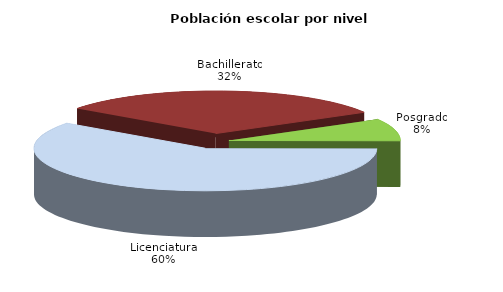
| Category | Series 0 |
|---|---|
| Posgrado | 30089 |
| Licenciatura | 213004 |
| Bachillerato | 112588 |